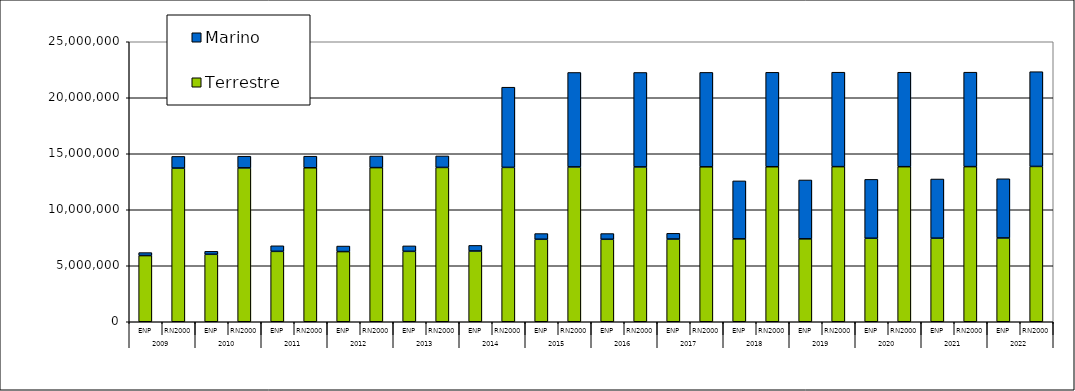
| Category | Terrestre | Marino |
|---|---|---|
| 0 | 5908859.398 | 266016.425 |
| 1 | 13719811.817 | 1043748.295 |
| 2 | 6022675.009 | 265807.201 |
| 3 | 13738572.132 | 1043627.61 |
| 4 | 6285291.148 | 496953.086 |
| 5 | 13748058.309 | 1035475.244 |
| 6 | 6265278.145 | 495244.49 |
| 7 | 13763064.804 | 1034992.765 |
| 8 | 6286152.796 | 488307.222 |
| 9 | 13778251.976 | 1028089.679 |
| 10 | 6316313.942 | 500808.803 |
| 11 | 13783417.466 | 7159304.664 |
| 12 | 7363769 | 511448 |
| 13 | 13825030 | 8432232 |
| 14 | 7363769.056 | 511447.998 |
| 15 | 13825029.749 | 8432232.278 |
| 16 | 7383423.682 | 511446.587 |
| 17 | 13833014.676 | 8432232.304 |
| 18 | 7402026.851 | 5175131.058 |
| 19 | 13839509.365 | 8432215.426 |
| 20 | 7403238.598 | 5256610.799 |
| 21 | 13849073.283 | 8432208.524 |
| 22 | 7455092.462 | 5257161.118 |
| 23 | 13846016.345 | 8432199.357 |
| 24 | 7461136.181 | 5283829.003 |
| 25 | 13850801.549 | 8432140.164 |
| 26 | 7481556.253 | 5283829.965 |
| 27 | 13868491.774 | 8458836.254 |